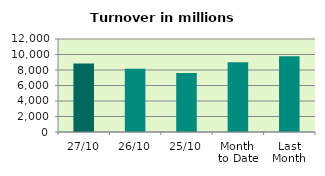
| Category | Series 0 |
|---|---|
| 27/10 | 8828.509 |
| 26/10 | 8170.231 |
| 25/10 | 7599.107 |
| Month 
to Date | 9005.097 |
| Last
Month | 9769.37 |